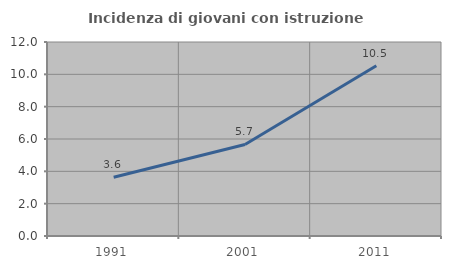
| Category | Incidenza di giovani con istruzione universitaria |
|---|---|
| 1991.0 | 3.636 |
| 2001.0 | 5.66 |
| 2011.0 | 10.526 |